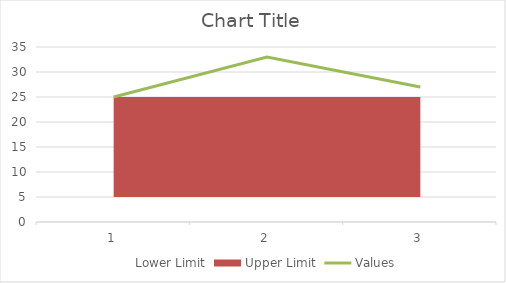
| Category | Values |
|---|---|
| 0 | 25 |
| 1 | 33 |
| 2 | 27 |